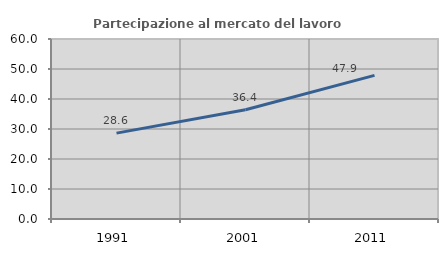
| Category | Partecipazione al mercato del lavoro  femminile |
|---|---|
| 1991.0 | 28.629 |
| 2001.0 | 36.404 |
| 2011.0 | 47.876 |